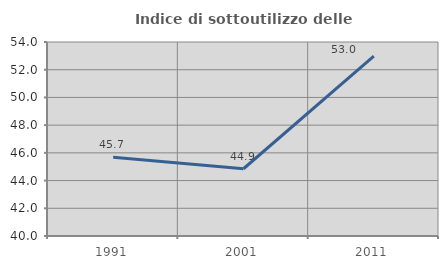
| Category | Indice di sottoutilizzo delle abitazioni  |
|---|---|
| 1991.0 | 45.688 |
| 2001.0 | 44.853 |
| 2011.0 | 52.975 |